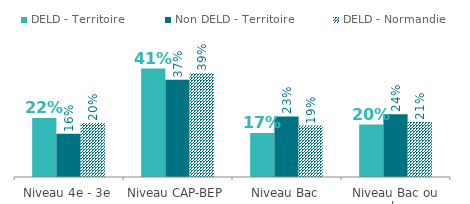
| Category | DELD - Territoire | Non DELD - Territoire | DELD - Normandie |
|---|---|---|---|
| Niveau 4e - 3e | 0.224 | 0.164 | 0.204 |
| Niveau CAP-BEP | 0.411 | 0.368 | 0.393 |
| Niveau Bac | 0.167 | 0.229 | 0.195 |
| Niveau Bac ou plus | 0.199 | 0.238 | 0.208 |